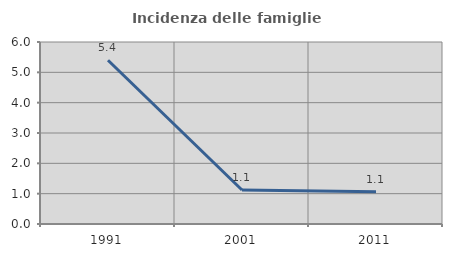
| Category | Incidenza delle famiglie numerose |
|---|---|
| 1991.0 | 5.4 |
| 2001.0 | 1.12 |
| 2011.0 | 1.06 |